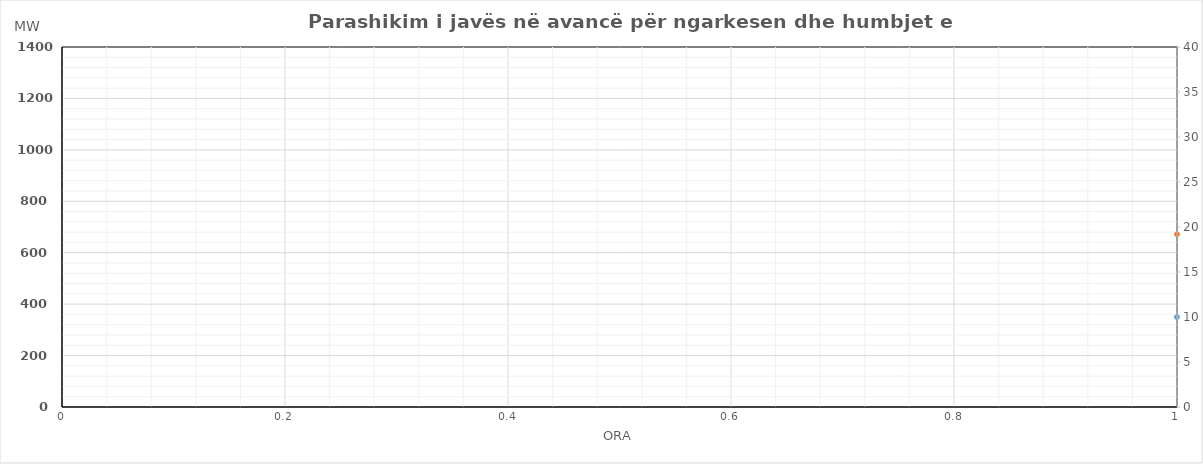
| Category | Ngarkesa (MWh) |
|---|---|
| 0 | 672 |
| 1 | 597 |
| 2 | 567 |
| 3 | 558 |
| 4 | 567 |
| 5 | 637 |
| 6 | 800 |
| 7 | 973 |
| 8 | 1101 |
| 9 | 1142 |
| 10 | 1109 |
| 11 | 1075 |
| 12 | 1056 |
| 13 | 1061 |
| 14 | 1093 |
| 15 | 1082 |
| 16 | 1098 |
| 17 | 1158 |
| 18 | 1302 |
| 19 | 1331 |
| 20 | 1295 |
| 21 | 1187 |
| 22 | 1006 |
| 23 | 880 |
| 24 | 730 |
| 25 | 620 |
| 26 | 566 |
| 27 | 554 |
| 28 | 564 |
| 29 | 622 |
| 30 | 767 |
| 31 | 944 |
| 32 | 1070 |
| 33 | 1090 |
| 34 | 1065 |
| 35 | 1038 |
| 36 | 1022 |
| 37 | 1025 |
| 38 | 1042 |
| 39 | 1034 |
| 40 | 1043 |
| 41 | 1122 |
| 42 | 1279 |
| 43 | 1315 |
| 44 | 1286 |
| 45 | 1171 |
| 46 | 920 |
| 47 | 790 |
| 48 | 681 |
| 49 | 603 |
| 50 | 576 |
| 51 | 564 |
| 52 | 574 |
| 53 | 632 |
| 54 | 790 |
| 55 | 930 |
| 56 | 1080 |
| 57 | 1100 |
| 58 | 1075 |
| 59 | 1048 |
| 60 | 1032 |
| 61 | 1035 |
| 62 | 1052 |
| 63 | 1044 |
| 64 | 1053 |
| 65 | 1132 |
| 66 | 1289 |
| 67 | 1325 |
| 68 | 1296 |
| 69 | 1130 |
| 70 | 991 |
| 71 | 805 |
| 72 | 750 |
| 73 | 662 |
| 74 | 587 |
| 75 | 557 |
| 76 | 548 |
| 77 | 645 |
| 78 | 720 |
| 79 | 820 |
| 80 | 963 |
| 81 | 1091 |
| 82 | 1132 |
| 83 | 1099 |
| 84 | 1065 |
| 85 | 1046 |
| 86 | 1051 |
| 87 | 1083 |
| 88 | 1072 |
| 89 | 1088 |
| 90 | 1148 |
| 91 | 1292 |
| 92 | 1321 |
| 93 | 1285 |
| 94 | 1089 |
| 95 | 900 |
| 96 | 730 |
| 97 | 608 |
| 98 | 581 |
| 99 | 569 |
| 100 | 579 |
| 101 | 637 |
| 102 | 782 |
| 103 | 959 |
| 104 | 1085 |
| 105 | 1105 |
| 106 | 1080 |
| 107 | 1053 |
| 108 | 1037 |
| 109 | 1040 |
| 110 | 1057 |
| 111 | 1049 |
| 112 | 1058 |
| 113 | 1137 |
| 114 | 1294 |
| 115 | 1330 |
| 116 | 1301 |
| 117 | 1186 |
| 118 | 996 |
| 119 | 810 |
| 120 | 671 |
| 121 | 596 |
| 122 | 566 |
| 123 | 557 |
| 124 | 620 |
| 125 | 710 |
| 126 | 820 |
| 127 | 972 |
| 128 | 1100 |
| 129 | 1141 |
| 130 | 1108 |
| 131 | 1074 |
| 132 | 1055 |
| 133 | 1060 |
| 134 | 1092 |
| 135 | 1081 |
| 136 | 1097 |
| 137 | 1157 |
| 138 | 1301 |
| 139 | 1330 |
| 140 | 1294 |
| 141 | 1186 |
| 142 | 1005 |
| 143 | 850 |
| 144 | 700 |
| 145 | 610 |
| 146 | 557 |
| 147 | 548 |
| 148 | 620 |
| 149 | 700 |
| 150 | 820 |
| 151 | 963 |
| 152 | 1091 |
| 153 | 1132 |
| 154 | 1099 |
| 155 | 1065 |
| 156 | 1046 |
| 157 | 1051 |
| 158 | 1083 |
| 159 | 1072 |
| 160 | 1088 |
| 161 | 1148 |
| 162 | 1292 |
| 163 | 1321 |
| 164 | 1285 |
| 165 | 1177 |
| 166 | 996 |
| 167 | 740 |